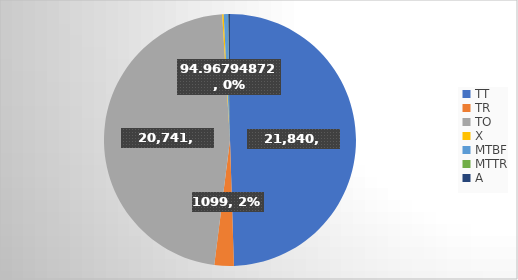
| Category | Series 0 |
|---|---|
| TT | 21840 |
| TR | 1099 |
| TO | 20741 |
| X | 85 |
| MTBF | 244.012 |
| MTTR | 12.929 |
| A | 94.968 |